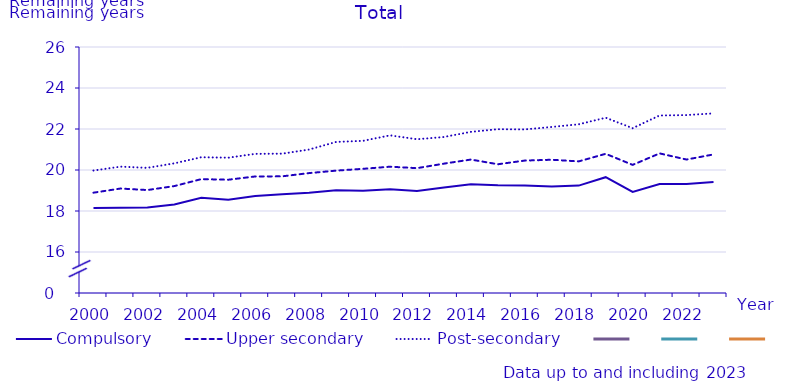
| Category | Compulsory | Upper secondary | Post-secondary | #REFERENS! |
|---|---|---|---|---|
| 2000.0 | 18.146 | 18.893 | 19.974 | 0 |
| 2001.0 | 18.158 | 19.096 | 20.164 | 0 |
| 2002.0 | 18.167 | 19.022 | 20.105 | 0 |
| 2003.0 | 18.318 | 19.216 | 20.325 | 0 |
| 2004.0 | 18.646 | 19.555 | 20.623 | 0 |
| 2005.0 | 18.552 | 19.526 | 20.6 | 0 |
| 2006.0 | 18.73 | 19.685 | 20.787 | 0 |
| 2007.0 | 18.817 | 19.691 | 20.798 | 0 |
| 2008.0 | 18.885 | 19.85 | 20.999 | 0 |
| 2009.0 | 19.016 | 19.969 | 21.369 | 0 |
| 2010.0 | 18.989 | 20.058 | 21.422 | 0 |
| 2011.0 | 19.066 | 20.161 | 21.69 | 0 |
| 2012.0 | 18.98 | 20.09 | 21.5 | 0 |
| 2013.0 | 19.15 | 20.31 | 21.61 | 0 |
| 2014.0 | 19.31 | 20.51 | 21.86 | 0 |
| 2015.0 | 19.26 | 20.28 | 21.99 | 0 |
| 2016.0 | 19.24 | 20.46 | 21.98 | 0 |
| 2017.0 | 19.2 | 20.5 | 22.1 | 0 |
| 2018.0 | 19.24 | 20.42 | 22.23 | 0 |
| 2019.0 | 19.65 | 20.79 | 22.55 | 0 |
| 2020.0 | 18.93 | 20.25 | 22.04 | 0 |
| 2021.0 | 19.32 | 20.81 | 22.66 | 0 |
| 2022.0 | 19.32 | 20.51 | 22.68 | 0 |
| 2023.0 | 19.42 | 20.76 | 22.76 | 0 |